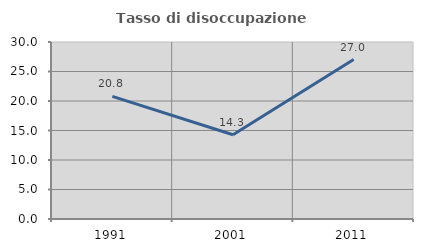
| Category | Tasso di disoccupazione giovanile  |
|---|---|
| 1991.0 | 20.792 |
| 2001.0 | 14.286 |
| 2011.0 | 27.027 |